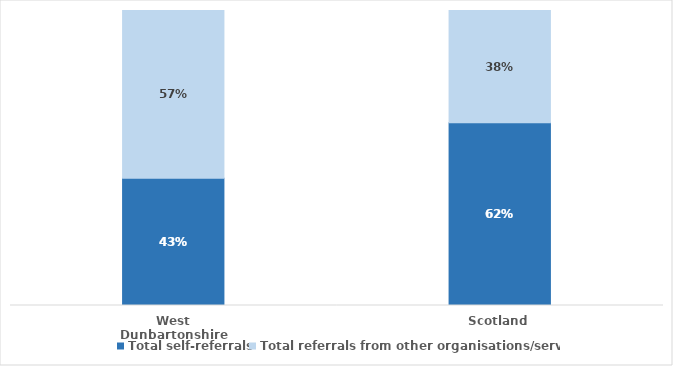
| Category | Total self-referrals | Total referrals from other organisations/services |
|---|---|---|
| West Dunbartonshire | 0.431 | 0.569 |
| Scotland | 0.619 | 0.381 |